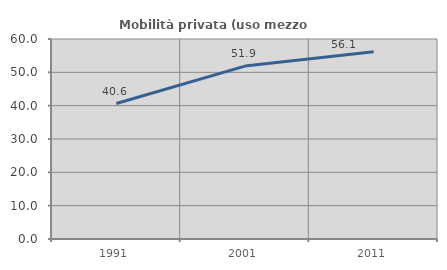
| Category | Mobilità privata (uso mezzo privato) |
|---|---|
| 1991.0 | 40.639 |
| 2001.0 | 51.875 |
| 2011.0 | 56.149 |